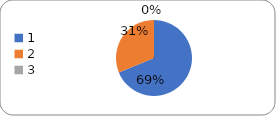
| Category | Series 0 |
|---|---|
| 0 | 75 |
| 1 | 34 |
| 2 | 0 |